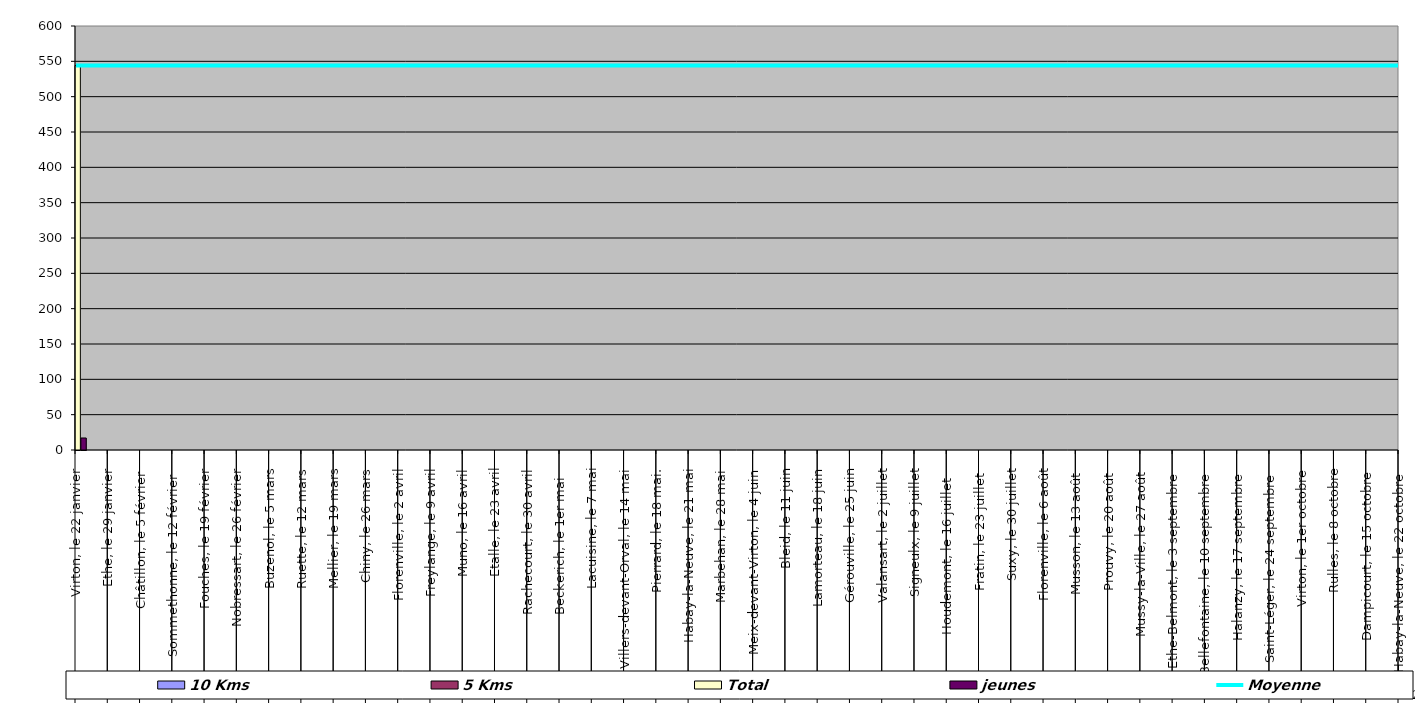
| Category | 10 Kms | 5 Kms | Total | jeunes |
|---|---|---|---|---|
| 0 | 296 | 231 | 544 | 17 |
| 1 | 0 | 0 | 0 | 0 |
| 2 | 0 | 0 | 0 | 0 |
| 3 | 0 | 0 | 0 | 0 |
| 4 | 0 | 0 | 0 | 0 |
| 5 | 0 | 0 | 0 | 0 |
| 6 | 0 | 0 | 0 | 0 |
| 7 | 0 | 0 | 0 | 0 |
| 8 | 0 | 0 | 0 | 0 |
| 9 | 0 | 0 | 0 | 0 |
| 10 | 0 | 0 | 0 | 0 |
| 11 | 0 | 0 | 0 | 0 |
| 12 | 0 | 0 | 0 | 0 |
| 13 | 0 | 0 | 0 | 0 |
| 14 | 0 | 0 | 0 | 0 |
| 15 | 0 | 0 | 0 | 0 |
| 16 | 0 | 0 | 0 | 0 |
| 17 | 0 | 0 | 0 | 0 |
| 18 | 0 | 0 | 0 | 0 |
| 19 | 0 | 0 | 0 | 0 |
| 20 | 0 | 0 | 0 | 0 |
| 21 | 0 | 0 | 0 | 0 |
| 22 | 0 | 0 | 0 | 0 |
| 23 | 0 | 0 | 0 | 0 |
| 24 | 0 | 0 | 0 | 0 |
| 25 | 0 | 0 | 0 | 0 |
| 26 | 0 | 0 | 0 | 0 |
| 27 | 0 | 0 | 0 | 0 |
| 28 | 0 | 0 | 0 | 0 |
| 29 | 0 | 0 | 0 | 0 |
| 30 | 0 | 0 | 0 | 0 |
| 31 | 0 | 0 | 0 | 0 |
| 32 | 0 | 0 | 0 | 0 |
| 33 | 0 | 0 | 0 | 0 |
| 34 | 0 | 0 | 0 | 0 |
| 35 | 0 | 0 | 0 | 0 |
| 36 | 0 | 0 | 0 | 0 |
| 37 | 0 | 0 | 0 | 0 |
| 38 | 0 | 0 | 0 | 0 |
| 39 | 0 | 0 | 0 | 0 |
| 40 | 0 | 0 | 0 | 0 |
| 41 | 0 | 0 | 0 | 0 |